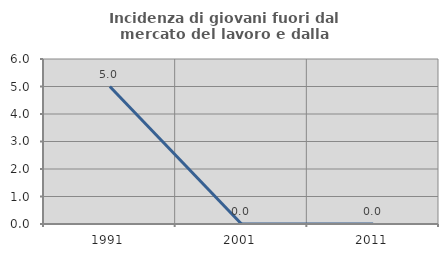
| Category | Incidenza di giovani fuori dal mercato del lavoro e dalla formazione  |
|---|---|
| 1991.0 | 5 |
| 2001.0 | 0 |
| 2011.0 | 0 |